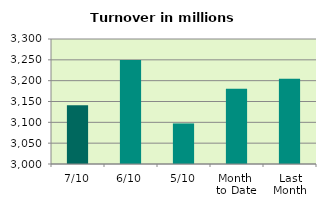
| Category | Series 0 |
|---|---|
| 7/10 | 3140.885 |
| 6/10 | 3249.841 |
| 5/10 | 3097.343 |
| Month 
to Date | 3180.325 |
| Last
Month | 3204.516 |